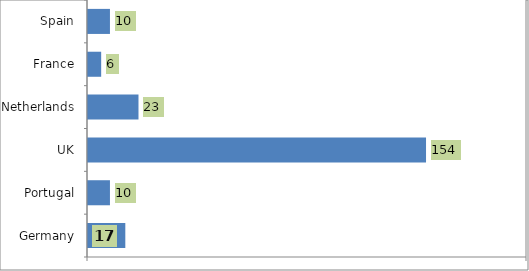
| Category | Series 0 |
|---|---|
| Germany | 17 |
| Portugal | 10 |
| UK | 154 |
| Netherlands | 23 |
| France | 6 |
| Spain | 10 |